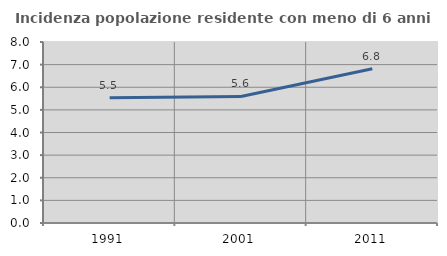
| Category | Incidenza popolazione residente con meno di 6 anni |
|---|---|
| 1991.0 | 5.535 |
| 2001.0 | 5.594 |
| 2011.0 | 6.816 |